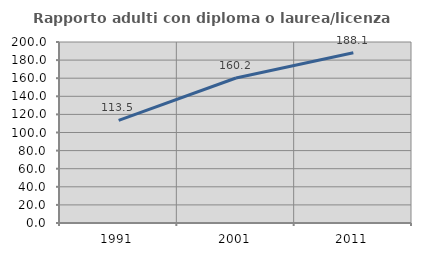
| Category | Rapporto adulti con diploma o laurea/licenza media  |
|---|---|
| 1991.0 | 113.474 |
| 2001.0 | 160.229 |
| 2011.0 | 188.078 |